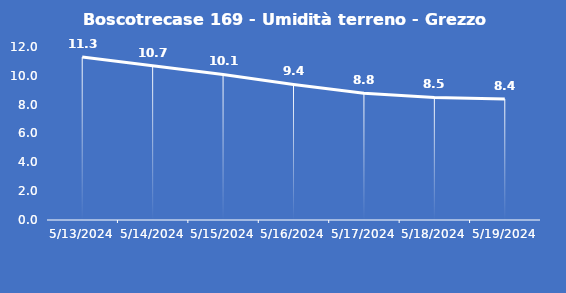
| Category | Boscotrecase 169 - Umidità terreno - Grezzo (%VWC) |
|---|---|
| 5/13/24 | 11.3 |
| 5/14/24 | 10.7 |
| 5/15/24 | 10.1 |
| 5/16/24 | 9.4 |
| 5/17/24 | 8.8 |
| 5/18/24 | 8.5 |
| 5/19/24 | 8.4 |